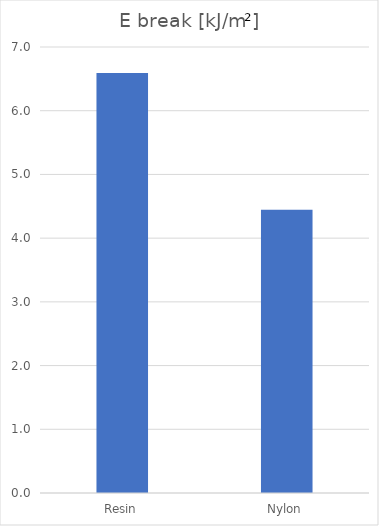
| Category | E [kJ/m²] |
|---|---|
| Resin | 6.591 |
| Nylon | 4.445 |